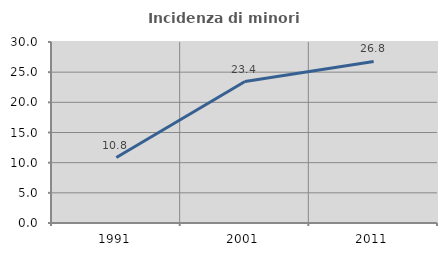
| Category | Incidenza di minori stranieri |
|---|---|
| 1991.0 | 10.843 |
| 2001.0 | 23.448 |
| 2011.0 | 26.777 |